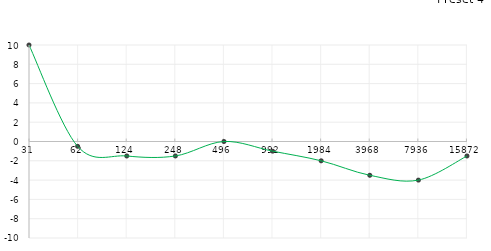
| Category | Series 0 |
|---|---|
| 31.0 | 10 |
| 62.0 | -0.5 |
| 125.0 | -1.5 |
| 250.0 | -1.5 |
| 500.0 | 0 |
| 1000.0 | -1 |
| 2000.0 | -2 |
| 4000.0 | -3.5 |
| 8000.0 | -4 |
| 16000.0 | -1.5 |